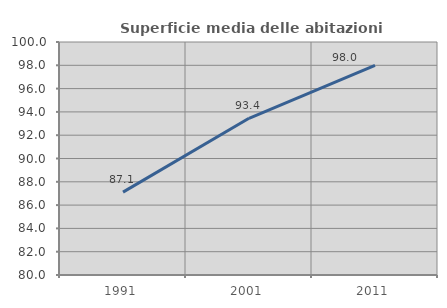
| Category | Superficie media delle abitazioni occupate |
|---|---|
| 1991.0 | 87.116 |
| 2001.0 | 93.449 |
| 2011.0 | 97.998 |